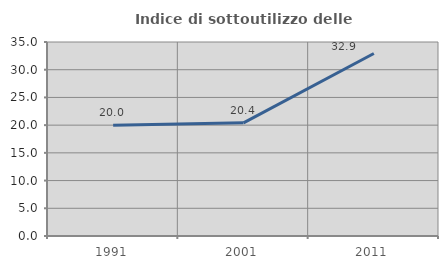
| Category | Indice di sottoutilizzo delle abitazioni  |
|---|---|
| 1991.0 | 19.987 |
| 2001.0 | 20.413 |
| 2011.0 | 32.918 |